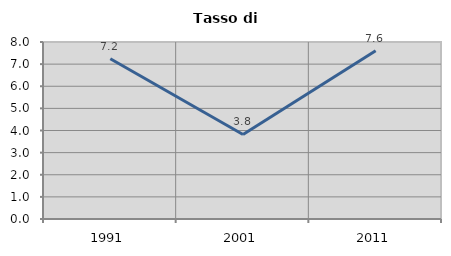
| Category | Tasso di disoccupazione   |
|---|---|
| 1991.0 | 7.24 |
| 2001.0 | 3.822 |
| 2011.0 | 7.609 |